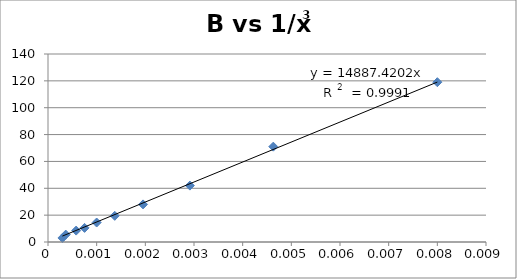
| Category | B |
|---|---|
| 0.008 | 119 |
| 0.004629629629629629 | 71 |
| 0.0029154518950437317 | 42 |
| 0.001953125 | 28 |
| 0.0013717421124828531 | 19.5 |
| 0.001 | 14.5 |
| 0.0007513148009015778 | 10.5 |
| 0.0005787037037037037 | 8.5 |
| 0.00036443148688046647 | 5.5 |
| 0.0002962962962962963 | 3 |